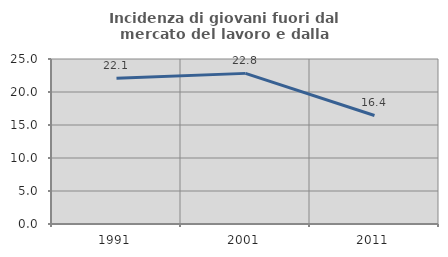
| Category | Incidenza di giovani fuori dal mercato del lavoro e dalla formazione  |
|---|---|
| 1991.0 | 22.086 |
| 2001.0 | 22.822 |
| 2011.0 | 16.442 |